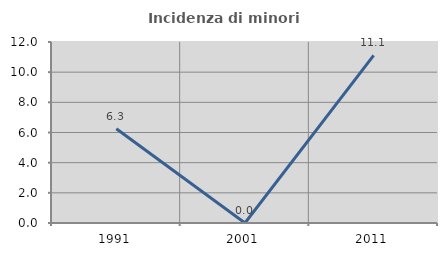
| Category | Incidenza di minori stranieri |
|---|---|
| 1991.0 | 6.25 |
| 2001.0 | 0 |
| 2011.0 | 11.111 |